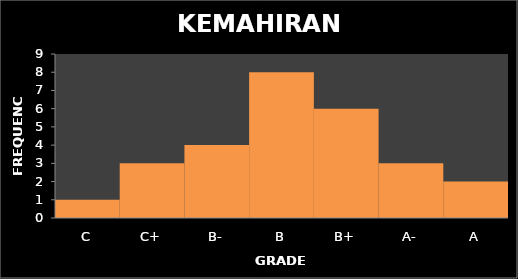
| Category | Series 0 |
|---|---|
| C | 1 |
| C+ | 3 |
| B- | 4 |
| B | 8 |
| B+ | 6 |
| A- | 3 |
| A | 2 |